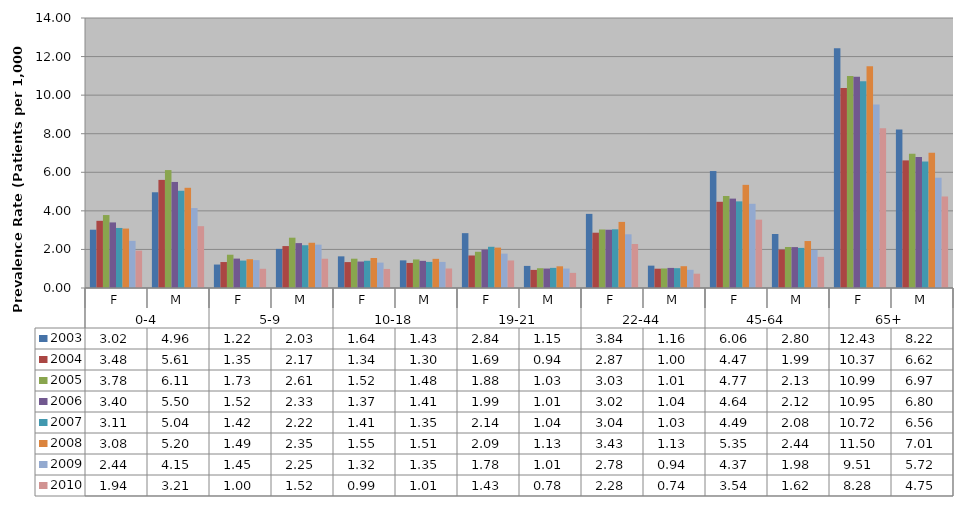
| Category | 2003 | 2004 | 2005 | 2006 | 2007 | 2008 | 2009 | 2010 |
|---|---|---|---|---|---|---|---|---|
| 0 | 3.022 | 3.484 | 3.783 | 3.4 | 3.113 | 3.082 | 2.445 | 1.939 |
| 1 | 4.964 | 5.606 | 6.114 | 5.499 | 5.042 | 5.197 | 4.145 | 3.205 |
| 2 | 1.216 | 1.346 | 1.726 | 1.524 | 1.421 | 1.493 | 1.446 | 0.996 |
| 3 | 2.028 | 2.174 | 2.608 | 2.328 | 2.218 | 2.345 | 2.247 | 1.518 |
| 4 | 1.642 | 1.344 | 1.519 | 1.371 | 1.412 | 1.554 | 1.316 | 0.989 |
| 5 | 1.432 | 1.299 | 1.48 | 1.408 | 1.354 | 1.512 | 1.353 | 1.011 |
| 6 | 2.844 | 1.686 | 1.879 | 1.991 | 2.137 | 2.095 | 1.782 | 1.427 |
| 7 | 1.146 | 0.939 | 1.025 | 1.009 | 1.044 | 1.125 | 1.009 | 0.785 |
| 8 | 3.844 | 2.867 | 3.034 | 3.021 | 3.044 | 3.427 | 2.785 | 2.282 |
| 9 | 1.159 | 1 | 1.013 | 1.042 | 1.028 | 1.13 | 0.943 | 0.742 |
| 10 | 6.064 | 4.47 | 4.772 | 4.635 | 4.492 | 5.348 | 4.366 | 3.543 |
| 11 | 2.8 | 1.989 | 2.127 | 2.121 | 2.08 | 2.435 | 1.977 | 1.616 |
| 12 | 12.433 | 10.37 | 10.994 | 10.947 | 10.721 | 11.497 | 9.513 | 8.283 |
| 13 | 8.216 | 6.617 | 6.967 | 6.796 | 6.558 | 7.008 | 5.719 | 4.745 |